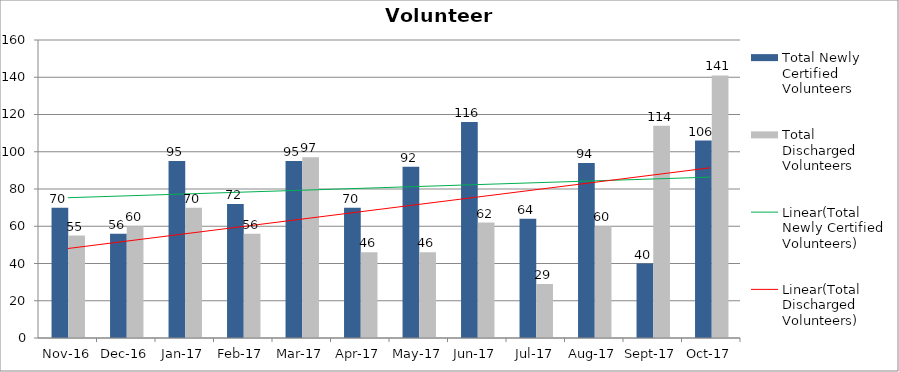
| Category | Total Newly Certified Volunteers | Total Discharged Volunteers |
|---|---|---|
| 2016-11-01 | 70 | 55 |
| 2016-12-01 | 56 | 60 |
| 2017-01-01 | 95 | 70 |
| 2017-02-01 | 72 | 56 |
| 2017-03-01 | 95 | 97 |
| 2017-04-01 | 70 | 46 |
| 2017-05-01 | 92 | 46 |
| 2017-06-01 | 116 | 62 |
| 2017-07-01 | 64 | 29 |
| 2017-08-01 | 94 | 60 |
| 2017-09-01 | 40 | 114 |
| 2017-10-01 | 106 | 141 |